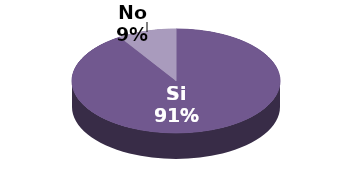
| Category | Series 1 |
|---|---|
| Si | 150 |
| No | 15 |